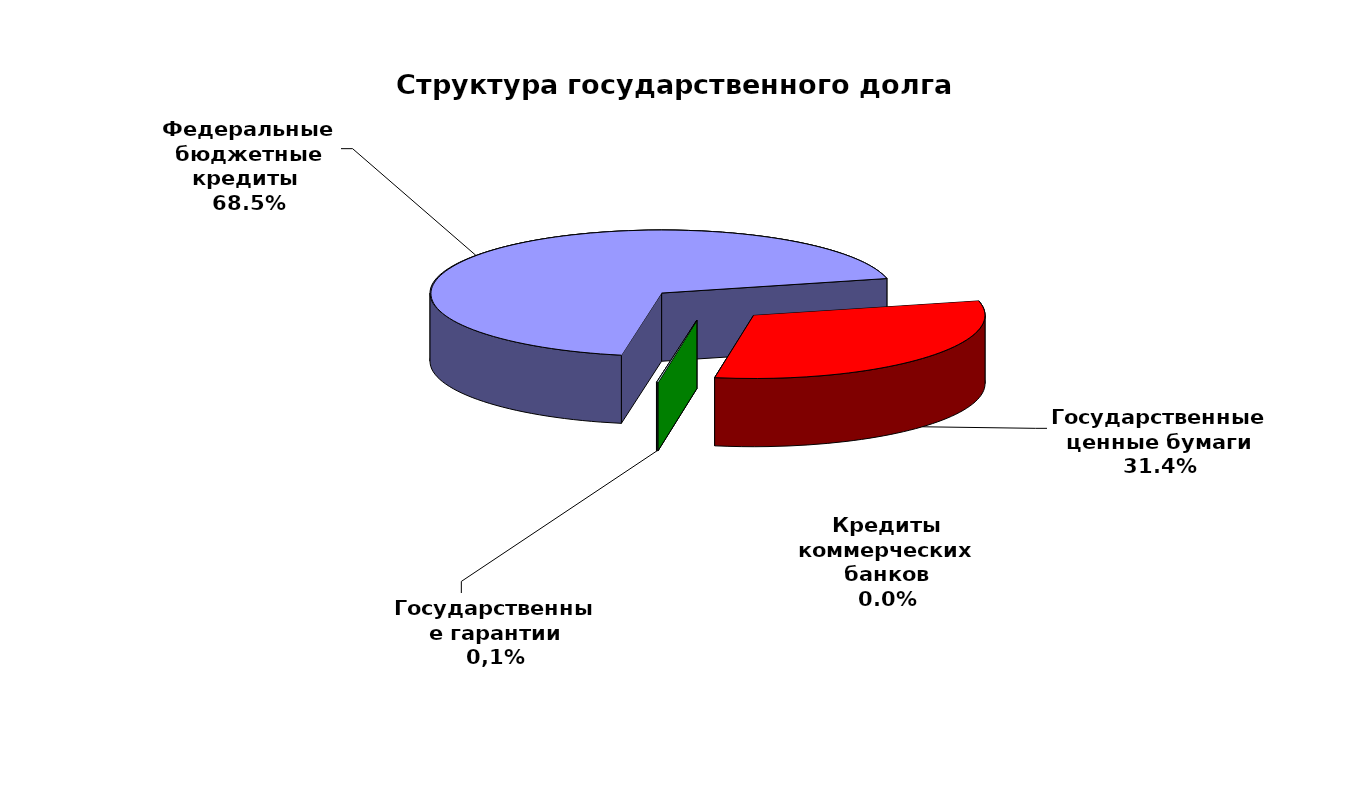
| Category | Series 0 |
|---|---|
| Федеральные бюджетные кредиты  | 90603290.06 |
| Государственные ценные бумаги | 41500000 |
| Кредиты коммерческих банков | 0 |
| Государственные гарантии | 129957.743 |